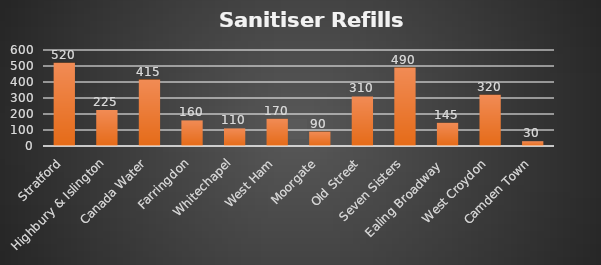
| Category | Litres |
|---|---|
| Stratford | 520 |
| Highbury & Islington | 225 |
| Canada Water | 415 |
| Farringdon | 160 |
| Whitechapel | 110 |
| West Ham | 170 |
| Moorgate | 90 |
| Old Street | 310 |
| Seven Sisters | 490 |
| Ealing Broadway  | 145 |
| West Croydon | 320 |
| Camden Town | 30 |